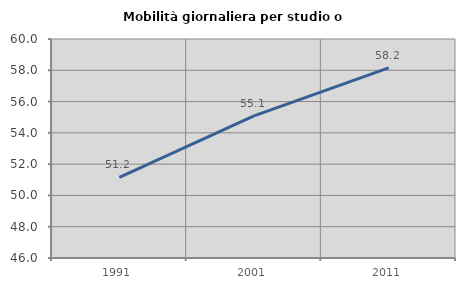
| Category | Mobilità giornaliera per studio o lavoro |
|---|---|
| 1991.0 | 51.152 |
| 2001.0 | 55.089 |
| 2011.0 | 58.152 |